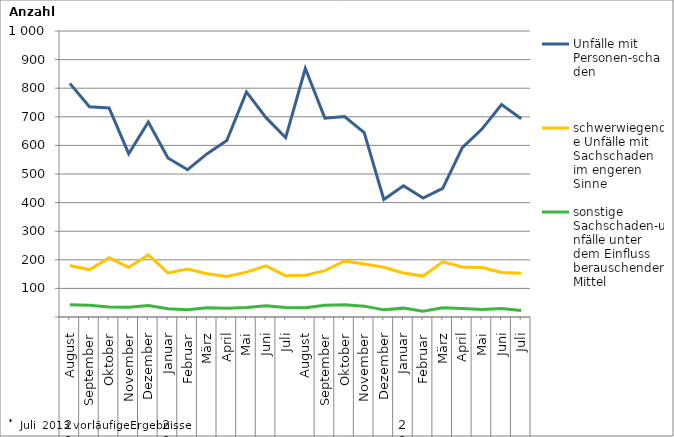
| Category | Unfälle mit Personen-schaden | schwerwiegende Unfälle mit Sachschaden   im engeren Sinne | sonstige Sachschaden-unfälle unter dem Einfluss berauschender Mittel |
|---|---|---|---|
| 0 | 817 | 180 | 43 |
| 1 | 735 | 165 | 41 |
| 2 | 731 | 207 | 35 |
| 3 | 571 | 174 | 34 |
| 4 | 682 | 217 | 40 |
| 5 | 556 | 154 | 29 |
| 6 | 515 | 168 | 25 |
| 7 | 571 | 151 | 32 |
| 8 | 617 | 142 | 31 |
| 9 | 787 | 157 | 33 |
| 10 | 697 | 179 | 39 |
| 11 | 627 | 144 | 33 |
| 12 | 869 | 146 | 32 |
| 13 | 695 | 162 | 41 |
| 14 | 701 | 196 | 43 |
| 15 | 645 | 185 | 38 |
| 16 | 411 | 174 | 25 |
| 17 | 459 | 154 | 31 |
| 18 | 416 | 143 | 20 |
| 19 | 450 | 193 | 32 |
| 20 | 592 | 175 | 30 |
| 21 | 657 | 173 | 26 |
| 22 | 743 | 156 | 30 |
| 23 | 693 | 153 | 23 |